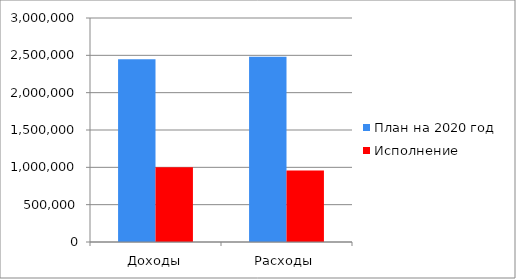
| Category | План на 2020 год | Исполнение |
|---|---|---|
| Доходы | 2446975.5 | 1001831.6 |
| Расходы | 2480352 | 958574.8 |